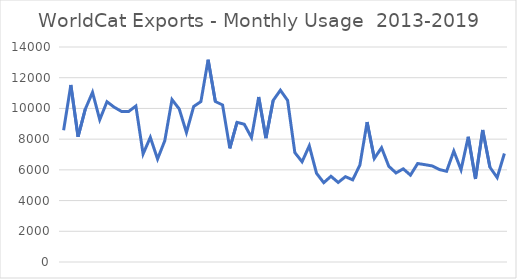
| Category | WorldCat Exports |
|---|---|
| 0 | 8577 |
| 1 | 11524 |
| 2 | 8154 |
| 3 | 9954 |
| 4 | 11050 |
| 5 | 9264 |
| 6 | 10436 |
| 7 | 10081 |
| 8 | 9807 |
| 9 | 9800 |
| 10 | 10157 |
| 11 | 7035 |
| 12 | 8118 |
| 13 | 6705 |
| 14 | 7896 |
| 15 | 10575 |
| 16 | 9967 |
| 17 | 8430 |
| 18 | 10126 |
| 19 | 10447 |
| 20 | 13173 |
| 21 | 10447 |
| 22 | 10227 |
| 23 | 7399 |
| 24 | 9093 |
| 25 | 8972 |
| 26 | 8104 |
| 27 | 10745 |
| 28 | 8066 |
| 29 | 10519 |
| 30 | 11187 |
| 31 | 10521 |
| 32 | 7125 |
| 33 | 6527 |
| 34 | 7565 |
| 35 | 5778 |
| 36 | 5165 |
| 37 | 5581 |
| 38 | 5180 |
| 39 | 5556 |
| 40 | 5351 |
| 41 | 6305 |
| 42 | 9111 |
| 43 | 6742 |
| 44 | 7442 |
| 45 | 6234 |
| 46 | 5800 |
| 47 | 6067 |
| 48 | 5656 |
| 49 | 6413 |
| 50 | 6339 |
| 51 | 6256 |
| 52 | 6022 |
| 53 | 5906 |
| 54 | 7222 |
| 55 | 6004 |
| 56 | 8148 |
| 57 | 5412 |
| 58 | 8598 |
| 59 | 6168 |
| 60 | 5490 |
| 61 | 7068 |